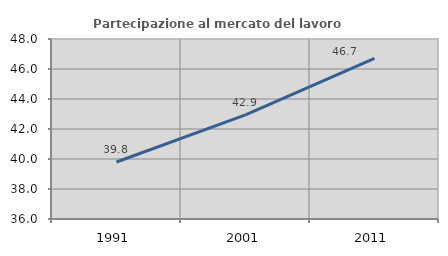
| Category | Partecipazione al mercato del lavoro  femminile |
|---|---|
| 1991.0 | 39.801 |
| 2001.0 | 42.938 |
| 2011.0 | 46.705 |